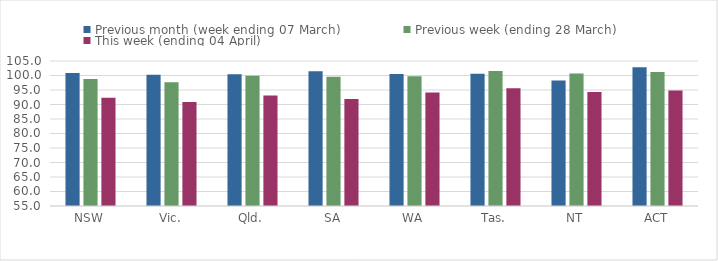
| Category | Previous month (week ending 07 March) | Previous week (ending 28 March) | This week (ending 04 April) |
|---|---|---|---|
| NSW | 100.879 | 98.771 | 92.336 |
| Vic. | 100.259 | 97.7 | 90.89 |
| Qld. | 100.448 | 99.942 | 93.121 |
| SA | 101.488 | 99.555 | 91.895 |
| WA | 100.52 | 99.74 | 94.12 |
| Tas. | 100.601 | 101.584 | 95.631 |
| NT | 98.303 | 100.727 | 94.303 |
| ACT | 102.827 | 101.201 | 94.841 |